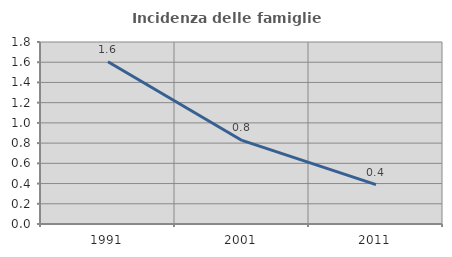
| Category | Incidenza delle famiglie numerose |
|---|---|
| 1991.0 | 1.604 |
| 2001.0 | 0.826 |
| 2011.0 | 0.389 |